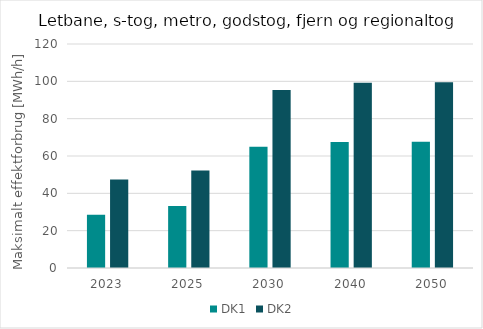
| Category | DK1 | DK2 |
|---|---|---|
| 2023.0 | 28.536 | 47.362 |
| 2025.0 | 33.231 | 52.221 |
| 2030.0 | 64.926 | 95.389 |
| 2040.0 | 67.552 | 99.247 |
| 2050.0 | 67.699 | 99.463 |